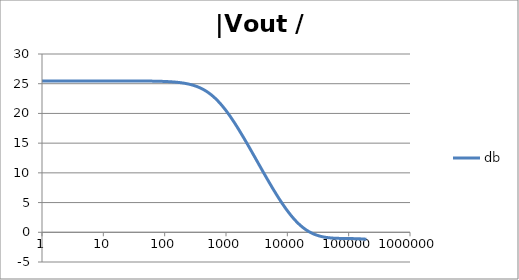
| Category | db |
|---|---|
| 1.0 | 25.472 |
| 1.0634378492473788 | 25.472 |
| 1.1309000592118907 | 25.472 |
| 1.2026419266820265 | 25.472 |
| 1.278934943925458 | 25.472 |
| 1.3600678260954062 | 25.472 |
| 1.4463476038134566 | 25.472 |
| 1.5381007850634825 | 25.472 |
| 1.6356745907936145 | 25.472 |
| 1.739438268902148 | 25.472 |
| 1.849784491579884 | 25.472 |
| 1.967130841296868 | 25.472 |
| 2.091921391056928 | 25.472 |
| 2.2246283849001642 | 25.472 |
| 2.365754025012901 | 25.472 |
| 2.5158323722080485 | 25.472 |
| 2.6754313669678584 | 25.472 |
| 2.8451549786972743 | 25.472 |
| 3.025645491321301 | 25.472 |
| 3.2175859338757533 | 25.472 |
| 3.42170266528945 | 25.472 |
| 3.6387681231394358 | 25.472 |
| 3.8696037467813236 | 25.472 |
| 4.115083085916729 | 25.472 |
| 4.376135106361553 | 25.472 |
| 4.653747705525078 | 25.472 |
| 4.948971450903514 | 25.472 |
| 5.262923555735513 | 25.472 |
| 5.596792106864742 | 25.472 |
| 5.951840560808945 | 25.472 |
| 6.329412525049976 | 25.472 |
| 6.730936842638569 | 25.472 |
| 7.157932999355504 | 25.472 |
| 7.612016873891456 | 25.472 |
| 8.094906852805886 | 25.472 |
| 8.608430333405762 | 25.472 |
| 9.154530639152917 | 25.472 |
| 9.735274373770007 | 25.472 |
| 10.352859241875105 | 25.471 |
| 11.009622365740512 | 25.471 |
| 11.708049129648925 | 25.471 |
| 12.4507825853165 | 25.471 |
| 13.240633453975693 | 25.471 |
| 14.080590762968805 | 25.471 |
| 14.973833157104059 | 25.47 |
| 15.923740927579823 | 25.47 |
| 16.93390880399795 | 25.47 |
| 18.008159557874837 | 25.469 |
| 19.150558469130036 | 25.469 |
| 20.365428710297824 | 25.469 |
| 21.65736770667993 | 25.468 |
| 23.031264534351347 | 25.467 |
| 24.492318421858034 | 25.467 |
| 26.046058425622668 | 25.466 |
| 27.698364353515743 | 25.465 |
| 29.45548901577305 | 25.464 |
| 31.32408188746347 | 25.463 |
| 33.311214272052936 | 25.462 |
| 35.42440606129053 | 25.461 |
| 37.67165419268462 | 25.459 |
| 40.06146291225952 | 25.457 |
| 42.60287595711691 | 25.455 |
| 45.30551077958928 | 25.453 |
| 48.17959494250036 | 25.451 |
| 51.23600482326248 | 25.448 |
| 54.486306773278585 | 25.445 |
| 57.94280088840825 | 25.441 |
| 61.61856755613799 | 25.437 |
| 65.52751695560372 | 25.432 |
| 69.68444169778837 | 25.427 |
| 74.10507280510043 | 25.421 |
| 78.80613924217637 | 25.414 |
| 83.8054312231895 | 25.407 |
| 89.12186753523771 | 25.398 |
| 94.77556713258299 | 25.389 |
| 100.78792527267464 | 25.378 |
| 107.18169448207877 | 25.366 |
| 113.98107065871142 | 25.352 |
| 121.21178463621371 | 25.336 |
| 128.90119955697148 | 25.319 |
| 137.07841442227294 | 25.299 |
| 145.77437421146283 | 25.277 |
| 155.02198698682062 | 25.252 |
| 164.85624842731968 | 25.224 |
| 175.3143742625403 | 25.192 |
| 186.43594110790573 | 25.157 |
| 198.26303623420247 | 25.117 |
| 210.84041683815525 | 25.073 |
| 224.21567941678887 | 25.023 |
| 238.43943988652958 | 24.968 |
| 253.56552512868072 | 24.906 |
| 269.65117668612646 | 24.837 |
| 286.75726738211927 | 24.76 |
| 304.9485316808965 | 24.675 |
| 324.2938106618788 | 24.581 |
| 344.8663125345048 | 24.477 |
| 366.7438896795682 | 24.362 |
| 390.00933326545766 | 24.236 |
| 414.7506865542229 | 24.097 |
| 441.06157808309626 | 23.945 |
| 469.0415759823428 | 23.78 |
| 498.7965647702637 | 23.601 |
| 530.4391460512702 | 23.406 |
| 564.089064633379 | 23.197 |
| 599.8736616776864 | 22.971 |
| 637.9283565946681 | 22.729 |
| 678.3971595109495 | 22.472 |
| 721.4332162458546 | 22.197 |
| 767.1993878601115 | 21.907 |
| 815.868866969862 | 21.601 |
| 867.6258331583267 | 21.278 |
| 922.6661499653554 | 20.941 |
| 981.1981060925172 | 20.589 |
| 1043.443203628628 | 20.223 |
| 1109.6369962786232 | 19.843 |
| 1180.0299807678607 | 19.451 |
| 1254.8885447951977 | 19.047 |
| 1334.4959751221782 | 18.632 |
| 1419.1535296132129 | 18.206 |
| 1509.1815772837017 | 17.771 |
| 1604.9208106703452 | 17.328 |
| 1706.7335351116335 | 16.877 |
| 1815.0050398174897 | 16.419 |
| 1930.1450559166665 | 15.954 |
| 2052.58930699948 | 15.485 |
| 2182.801158023697 | 15.01 |
| 2321.2733688234066 | 14.532 |
| 2468.5299588567814 | 14.05 |
| 2625.128190249376 | 13.566 |
| 2791.6606766374607 | 13.079 |
| 2968.757625791824 | 12.591 |
| 3157.08922450881 | 12.103 |
| 3357.3681747937244 | 11.614 |
| 3570.352390934236 | 11.125 |
| 3796.8478676703417 | 10.638 |
| 4037.7117303148448 | 10.152 |
| 4293.8554783669315 | 9.668 |
| 4566.248434893605 | 9.187 |
| 4855.9214147324665 | 8.71 |
| 5163.970625397384 | 8.237 |
| 5491.561815449236 | 7.769 |
| 5839.934686030357 | 7.307 |
| 6210.40758225729 | 6.851 |
| 6604.382482225307 | 6.403 |
| 7023.350302504747 | 5.962 |
| 7468.896540206577 | 5.531 |
| 7942.707272968458 | 5.109 |
| 8446.575539567106 | 4.698 |
| 8982.408125302747 | 4.298 |
| 9552.232777834151 | 3.911 |
| 10158.205880770249 | 3.537 |
| 10802.620614058389 | 3.176 |
| 11487.915632049675 | 2.831 |
| 12216.684292082227 | 2.5 |
| 12991.684468506162 | 2.186 |
| 13815.848989288772 | 1.887 |
| 14692.296734695852 | 1.605 |
| 15624.344440049217 | 1.341 |
| 16615.519247226184 | 1.093 |
| 17669.572052398642 | 0.862 |
| 18790.49170052441 | 0.647 |
| 19982.5200803064 | 0.45 |
| 21250.168176743602 | 0.268 |
| 22598.233142021272 | 0.102 |
| 24031.816449341983 | -0.048 |
| 25556.34319839602 | -0.185 |
| 27177.582645530147 | -0.307 |
| 28901.67003630542 | -0.416 |
| 30735.129823066054 | -0.513 |
| 32684.900355380338 | -0.599 |
| 34758.3601367905 | -0.674 |
| 36963.35574723439 | -0.739 |
| 39308.23153680468 | -0.795 |
| 41801.861203217486 | -0.843 |
| 44453.68137248706 | -0.883 |
| 47273.727309885995 | -0.917 |
| 50272.670896332245 | -0.945 |
| 53461.86101391677 | -0.968 |
| 56853.36649340195 | -0.987 |
| 60460.02178621637 | -1.002 |
| 64295.47553378361 | -1.013 |
| 68374.24221798431 | -1.023 |
| 72711.75708821259 | -1.03 |
| 77324.43457288652 | -1.036 |
| 82229.73039646025 | -1.04 |
| 87446.2076370035 | -1.044 |
| 92993.60697433475 | -1.048 |
| 98892.92139454243 | -1.052 |
| 105166.47563360249 | -1.056 |
| 111838.01066072512 | -1.061 |
| 118932.77352114675 | -1.066 |
| 126477.61287835392 | -1.073 |
| 134501.0806172993 | -1.081 |
| 143033.53989310883 | -1.091 |
| 152107.28003416685 | -1.102 |
| 161756.63873440344 | -1.116 |
| 172018.1319971993 | -1.132 |
| 182930.592322653 | -1.15 |
| 194535.31566115122 | -1.171 |